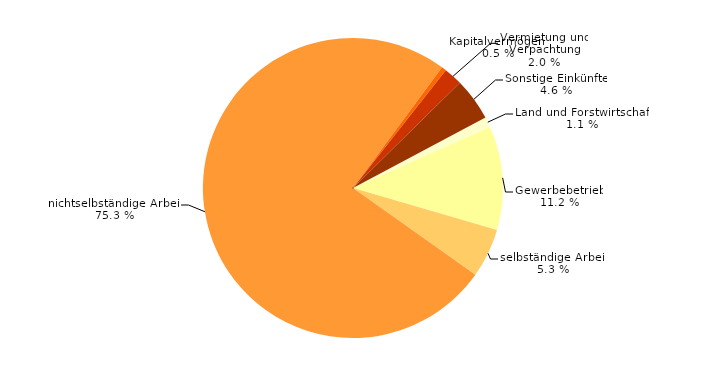
| Category | Series 0 |
|---|---|
| Land und Forstwirtschaft | 1.1 |
| Gewerbebetrieb | 11.2 |
| selbständige Arbeit | 5.3 |
| nichtselbständige Arbeit | 75.3 |
| Kapitalvermögen¹ | 0.5 |
| Vermietung und Verpachtung | 2 |
| Sonstige Einkünfte | 4.6 |